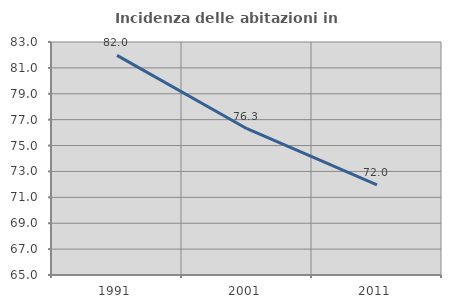
| Category | Incidenza delle abitazioni in proprietà  |
|---|---|
| 1991.0 | 81.964 |
| 2001.0 | 76.301 |
| 2011.0 | 71.964 |